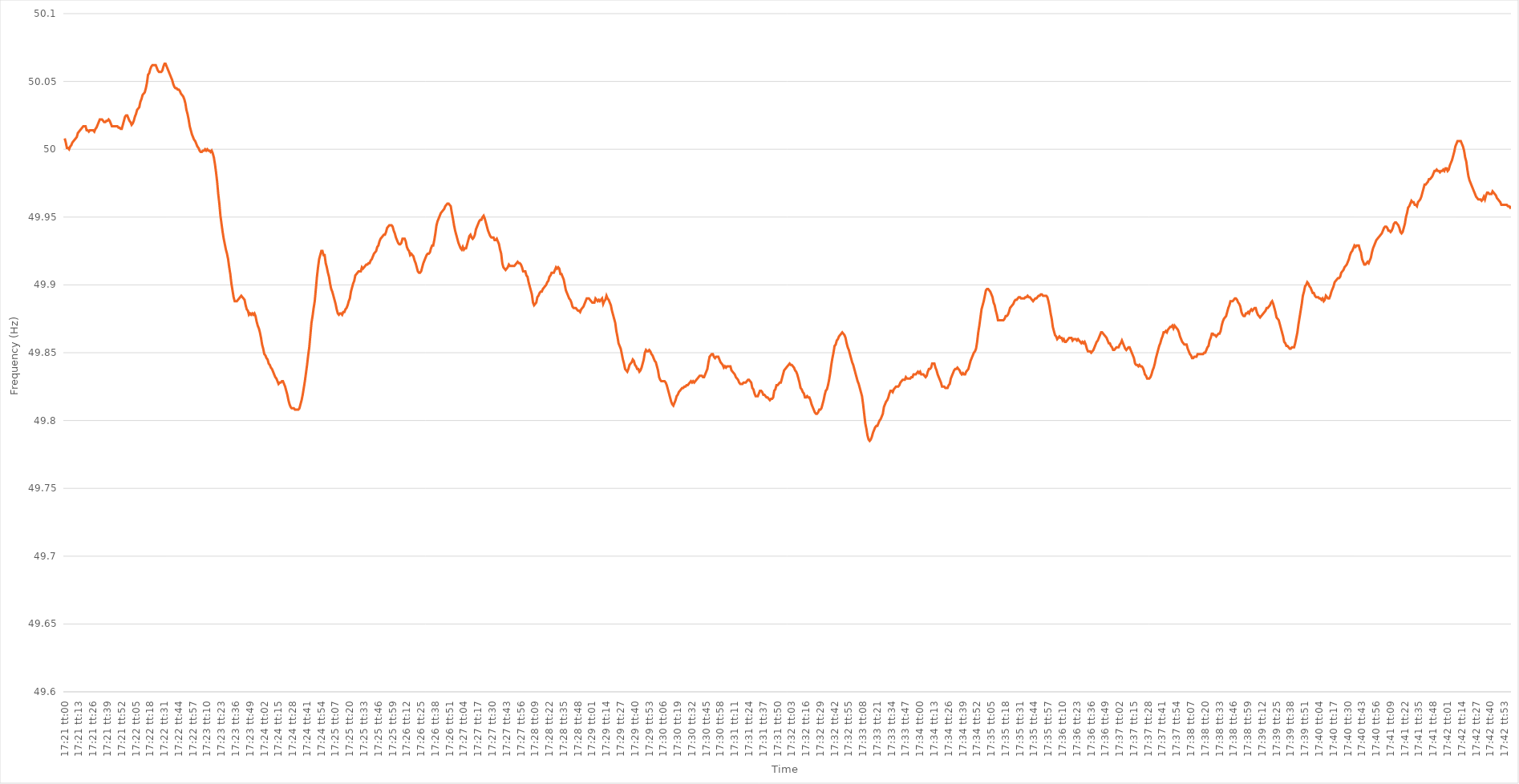
| Category | Series 0 |
|---|---|
| 0.7229166666666668 | 50.008 |
| 0.7229282407407407 | 50.005 |
| 0.7229398148148148 | 50.001 |
| 0.7229513888888889 | 50.001 |
| 0.722962962962963 | 50 |
| 0.722974537037037 | 50.002 |
| 0.7229861111111111 | 50.003 |
| 0.7229976851851853 | 50.005 |
| 0.7230092592592593 | 50.006 |
| 0.7230208333333333 | 50.007 |
| 0.7230324074074074 | 50.008 |
| 0.7230439814814815 | 50.009 |
| 0.7230555555555555 | 50.012 |
| 0.7230671296296296 | 50.013 |
| 0.7230787037037038 | 50.014 |
| 0.7230902777777778 | 50.015 |
| 0.7231018518518518 | 50.016 |
| 0.7231134259259259 | 50.017 |
| 0.723125 | 50.017 |
| 0.7231365740740742 | 50.017 |
| 0.7231481481481481 | 50.014 |
| 0.7231597222222222 | 50.014 |
| 0.7231712962962963 | 50.013 |
| 0.7231828703703704 | 50.014 |
| 0.7231944444444444 | 50.014 |
| 0.7232060185185185 | 50.014 |
| 0.7232175925925927 | 50.014 |
| 0.7232291666666667 | 50.013 |
| 0.7232407407407407 | 50.015 |
| 0.7232523148148148 | 50.016 |
| 0.7232638888888889 | 50.018 |
| 0.7232754629629629 | 50.02 |
| 0.723287037037037 | 50.022 |
| 0.7232986111111112 | 50.022 |
| 0.7233101851851852 | 50.022 |
| 0.7233217592592592 | 50.021 |
| 0.7233333333333333 | 50.02 |
| 0.7233449074074074 | 50.02 |
| 0.7233564814814816 | 50.021 |
| 0.7233680555555555 | 50.021 |
| 0.7233796296296297 | 50.022 |
| 0.7233912037037037 | 50.021 |
| 0.7234027777777778 | 50.019 |
| 0.7234143518518518 | 50.017 |
| 0.7234259259259259 | 50.017 |
| 0.7234375000000001 | 50.017 |
| 0.7234490740740741 | 50.017 |
| 0.7234606481481481 | 50.017 |
| 0.7234722222222222 | 50.017 |
| 0.7234837962962963 | 50.016 |
| 0.7234953703703703 | 50.016 |
| 0.7235069444444444 | 50.015 |
| 0.7235185185185186 | 50.015 |
| 0.7235300925925926 | 50.018 |
| 0.7235416666666666 | 50.021 |
| 0.7235532407407407 | 50.024 |
| 0.7235648148148148 | 50.025 |
| 0.723576388888889 | 50.025 |
| 0.7235879629629629 | 50.023 |
| 0.723599537037037 | 50.021 |
| 0.7236111111111111 | 50.02 |
| 0.7236226851851852 | 50.018 |
| 0.7236342592592592 | 50.019 |
| 0.7236458333333333 | 50.021 |
| 0.7236574074074075 | 50.024 |
| 0.7236689814814815 | 50.026 |
| 0.7236805555555555 | 50.029 |
| 0.7236921296296296 | 50.03 |
| 0.7237037037037037 | 50.031 |
| 0.7237152777777777 | 50.035 |
| 0.7237268518518518 | 50.037 |
| 0.723738425925926 | 50.04 |
| 0.72375 | 50.041 |
| 0.723761574074074 | 50.042 |
| 0.7237731481481481 | 50.045 |
| 0.7237847222222222 | 50.049 |
| 0.7237962962962964 | 50.055 |
| 0.7238078703703703 | 50.056 |
| 0.7238194444444445 | 50.059 |
| 0.7238310185185185 | 50.061 |
| 0.7238425925925926 | 50.062 |
| 0.7238541666666666 | 50.062 |
| 0.7238657407407407 | 50.062 |
| 0.7238773148148149 | 50.062 |
| 0.7238888888888889 | 50.06 |
| 0.723900462962963 | 50.058 |
| 0.723912037037037 | 50.057 |
| 0.7239236111111111 | 50.057 |
| 0.7239351851851853 | 50.057 |
| 0.7239467592592592 | 50.058 |
| 0.7239583333333334 | 50.061 |
| 0.7239699074074074 | 50.063 |
| 0.7239814814814814 | 50.063 |
| 0.7239930555555555 | 50.061 |
| 0.7240046296296296 | 50.059 |
| 0.7240162037037038 | 50.057 |
| 0.7240277777777777 | 50.055 |
| 0.7240393518518519 | 50.053 |
| 0.7240509259259259 | 50.051 |
| 0.7240625 | 50.048 |
| 0.724074074074074 | 50.046 |
| 0.7240856481481481 | 50.045 |
| 0.7240972222222223 | 50.045 |
| 0.7241087962962963 | 50.044 |
| 0.7241203703703704 | 50.044 |
| 0.7241319444444444 | 50.043 |
| 0.7241435185185185 | 50.041 |
| 0.7241550925925927 | 50.04 |
| 0.7241666666666666 | 50.039 |
| 0.7241782407407408 | 50.037 |
| 0.7241898148148148 | 50.034 |
| 0.724201388888889 | 50.029 |
| 0.7242129629629629 | 50.026 |
| 0.724224537037037 | 50.022 |
| 0.7242361111111112 | 50.017 |
| 0.7242476851851851 | 50.014 |
| 0.7242592592592593 | 50.011 |
| 0.7242708333333333 | 50.009 |
| 0.7242824074074075 | 50.007 |
| 0.7242939814814814 | 50.006 |
| 0.7243055555555555 | 50.004 |
| 0.7243171296296297 | 50.002 |
| 0.7243287037037037 | 50.001 |
| 0.7243402777777778 | 49.999 |
| 0.7243518518518518 | 49.998 |
| 0.724363425925926 | 49.998 |
| 0.7243750000000001 | 49.999 |
| 0.724386574074074 | 49.999 |
| 0.7243981481481482 | 50 |
| 0.7244097222222222 | 49.999 |
| 0.7244212962962964 | 50 |
| 0.7244328703703703 | 49.999 |
| 0.7244444444444444 | 49.999 |
| 0.7244560185185186 | 49.998 |
| 0.7244675925925925 | 49.999 |
| 0.7244791666666667 | 49.997 |
| 0.7244907407407407 | 49.994 |
| 0.7245023148148149 | 49.989 |
| 0.7245138888888888 | 49.983 |
| 0.7245254629629629 | 49.976 |
| 0.7245370370370371 | 49.967 |
| 0.7245486111111111 | 49.96 |
| 0.7245601851851852 | 49.951 |
| 0.7245717592592592 | 49.945 |
| 0.7245833333333334 | 49.939 |
| 0.7245949074074075 | 49.934 |
| 0.7246064814814814 | 49.93 |
| 0.7246180555555556 | 49.926 |
| 0.7246296296296296 | 49.923 |
| 0.7246412037037038 | 49.919 |
| 0.7246527777777777 | 49.913 |
| 0.7246643518518519 | 49.908 |
| 0.724675925925926 | 49.901 |
| 0.7246874999999999 | 49.896 |
| 0.7246990740740741 | 49.891 |
| 0.7247106481481481 | 49.888 |
| 0.7247222222222223 | 49.888 |
| 0.7247337962962962 | 49.888 |
| 0.7247453703703703 | 49.889 |
| 0.7247569444444445 | 49.89 |
| 0.7247685185185185 | 49.891 |
| 0.7247800925925926 | 49.892 |
| 0.7247916666666666 | 49.891 |
| 0.7248032407407408 | 49.89 |
| 0.7248148148148149 | 49.889 |
| 0.7248263888888888 | 49.885 |
| 0.724837962962963 | 49.882 |
| 0.724849537037037 | 49.881 |
| 0.7248611111111112 | 49.878 |
| 0.7248726851851851 | 49.879 |
| 0.7248842592592593 | 49.878 |
| 0.7248958333333334 | 49.879 |
| 0.7249074074074073 | 49.878 |
| 0.7249189814814815 | 49.879 |
| 0.7249305555555555 | 49.877 |
| 0.7249421296296297 | 49.873 |
| 0.7249537037037036 | 49.87 |
| 0.7249652777777778 | 49.868 |
| 0.7249768518518519 | 49.865 |
| 0.7249884259259259 | 49.861 |
| 0.725 | 49.856 |
| 0.725011574074074 | 49.853 |
| 0.7250231481481482 | 49.849 |
| 0.7250347222222223 | 49.848 |
| 0.7250462962962962 | 49.846 |
| 0.7250578703703704 | 49.845 |
| 0.7250694444444444 | 49.842 |
| 0.7250810185185186 | 49.841 |
| 0.7250925925925925 | 49.839 |
| 0.7251041666666667 | 49.838 |
| 0.7251157407407408 | 49.836 |
| 0.7251273148148148 | 49.834 |
| 0.7251388888888889 | 49.832 |
| 0.7251504629629629 | 49.831 |
| 0.7251620370370371 | 49.829 |
| 0.725173611111111 | 49.827 |
| 0.7251851851851852 | 49.828 |
| 0.7251967592592593 | 49.828 |
| 0.7252083333333333 | 49.829 |
| 0.7252199074074074 | 49.829 |
| 0.7252314814814814 | 49.827 |
| 0.7252430555555556 | 49.825 |
| 0.7252546296296297 | 49.822 |
| 0.7252662037037036 | 49.819 |
| 0.7252777777777778 | 49.815 |
| 0.7252893518518518 | 49.812 |
| 0.725300925925926 | 49.81 |
| 0.7253124999999999 | 49.809 |
| 0.7253240740740741 | 49.809 |
| 0.7253356481481482 | 49.809 |
| 0.7253472222222223 | 49.808 |
| 0.7253587962962963 | 49.808 |
| 0.7253703703703703 | 49.808 |
| 0.7253819444444445 | 49.808 |
| 0.7253935185185184 | 49.809 |
| 0.7254050925925926 | 49.812 |
| 0.7254166666666667 | 49.815 |
| 0.7254282407407407 | 49.819 |
| 0.7254398148148148 | 49.824 |
| 0.7254513888888888 | 49.829 |
| 0.725462962962963 | 49.835 |
| 0.7254745370370371 | 49.841 |
| 0.725486111111111 | 49.848 |
| 0.7254976851851852 | 49.854 |
| 0.7255092592592592 | 49.863 |
| 0.7255208333333334 | 49.872 |
| 0.7255324074074073 | 49.877 |
| 0.7255439814814815 | 49.883 |
| 0.7255555555555556 | 49.888 |
| 0.7255671296296297 | 49.897 |
| 0.7255787037037037 | 49.906 |
| 0.7255902777777777 | 49.913 |
| 0.7256018518518519 | 49.919 |
| 0.725613425925926 | 49.922 |
| 0.725625 | 49.925 |
| 0.7256365740740741 | 49.925 |
| 0.7256481481481482 | 49.922 |
| 0.7256597222222222 | 49.922 |
| 0.7256712962962962 | 49.916 |
| 0.7256828703703704 | 49.913 |
| 0.7256944444444445 | 49.909 |
| 0.7257060185185185 | 49.906 |
| 0.7257175925925926 | 49.901 |
| 0.7257291666666666 | 49.897 |
| 0.7257407407407408 | 49.895 |
| 0.7257523148148147 | 49.892 |
| 0.7257638888888889 | 49.889 |
| 0.725775462962963 | 49.886 |
| 0.7257870370370371 | 49.882 |
| 0.7257986111111111 | 49.879 |
| 0.7258101851851851 | 49.878 |
| 0.7258217592592593 | 49.879 |
| 0.7258333333333334 | 49.879 |
| 0.7258449074074074 | 49.878 |
| 0.7258564814814815 | 49.88 |
| 0.7258680555555556 | 49.88 |
| 0.7258796296296296 | 49.882 |
| 0.7258912037037036 | 49.883 |
| 0.7259027777777778 | 49.885 |
| 0.7259143518518519 | 49.888 |
| 0.7259259259259259 | 49.89 |
| 0.7259375 | 49.895 |
| 0.725949074074074 | 49.898 |
| 0.7259606481481482 | 49.901 |
| 0.7259722222222221 | 49.903 |
| 0.7259837962962963 | 49.907 |
| 0.7259953703703704 | 49.908 |
| 0.7260069444444445 | 49.909 |
| 0.7260185185185185 | 49.91 |
| 0.7260300925925925 | 49.91 |
| 0.7260416666666667 | 49.91 |
| 0.7260532407407408 | 49.913 |
| 0.7260648148148148 | 49.912 |
| 0.7260763888888889 | 49.913 |
| 0.726087962962963 | 49.914 |
| 0.726099537037037 | 49.915 |
| 0.726111111111111 | 49.915 |
| 0.7261226851851852 | 49.916 |
| 0.7261342592592593 | 49.916 |
| 0.7261458333333333 | 49.918 |
| 0.7261574074074074 | 49.919 |
| 0.7261689814814815 | 49.921 |
| 0.7261805555555556 | 49.923 |
| 0.7261921296296295 | 49.924 |
| 0.7262037037037037 | 49.925 |
| 0.7262152777777778 | 49.928 |
| 0.7262268518518519 | 49.929 |
| 0.7262384259259259 | 49.932 |
| 0.72625 | 49.934 |
| 0.7262615740740741 | 49.935 |
| 0.7262731481481483 | 49.936 |
| 0.7262847222222222 | 49.937 |
| 0.7262962962962963 | 49.937 |
| 0.7263078703703704 | 49.939 |
| 0.7263194444444444 | 49.942 |
| 0.7263310185185184 | 49.943 |
| 0.7263425925925926 | 49.944 |
| 0.7263541666666667 | 49.944 |
| 0.7263657407407407 | 49.944 |
| 0.7263773148148148 | 49.943 |
| 0.7263888888888889 | 49.94 |
| 0.726400462962963 | 49.938 |
| 0.7264120370370369 | 49.935 |
| 0.7264236111111111 | 49.933 |
| 0.7264351851851852 | 49.931 |
| 0.7264467592592593 | 49.93 |
| 0.7264583333333333 | 49.93 |
| 0.7264699074074074 | 49.931 |
| 0.7264814814814815 | 49.934 |
| 0.7264930555555557 | 49.934 |
| 0.7265046296296296 | 49.934 |
| 0.7265162037037037 | 49.932 |
| 0.7265277777777778 | 49.928 |
| 0.7265393518518519 | 49.926 |
| 0.7265509259259259 | 49.925 |
| 0.7265625 | 49.922 |
| 0.7265740740740741 | 49.923 |
| 0.7265856481481481 | 49.922 |
| 0.7265972222222222 | 49.921 |
| 0.7266087962962963 | 49.918 |
| 0.7266203703703704 | 49.916 |
| 0.7266319444444443 | 49.913 |
| 0.7266435185185185 | 49.91 |
| 0.7266550925925926 | 49.909 |
| 0.7266666666666667 | 49.909 |
| 0.7266782407407407 | 49.91 |
| 0.7266898148148148 | 49.913 |
| 0.7267013888888889 | 49.916 |
| 0.7267129629629631 | 49.918 |
| 0.726724537037037 | 49.92 |
| 0.7267361111111111 | 49.922 |
| 0.7267476851851852 | 49.923 |
| 0.7267592592592593 | 49.923 |
| 0.7267708333333333 | 49.924 |
| 0.7267824074074074 | 49.927 |
| 0.7267939814814816 | 49.929 |
| 0.7268055555555556 | 49.929 |
| 0.7268171296296296 | 49.933 |
| 0.7268287037037037 | 49.938 |
| 0.7268402777777778 | 49.944 |
| 0.7268518518518517 | 49.947 |
| 0.7268634259259259 | 49.949 |
| 0.726875 | 49.951 |
| 0.7268865740740741 | 49.953 |
| 0.7268981481481481 | 49.954 |
| 0.7269097222222222 | 49.955 |
| 0.7269212962962963 | 49.956 |
| 0.7269328703703705 | 49.958 |
| 0.7269444444444444 | 49.959 |
| 0.7269560185185185 | 49.96 |
| 0.7269675925925926 | 49.96 |
| 0.7269791666666667 | 49.959 |
| 0.7269907407407407 | 49.958 |
| 0.7270023148148148 | 49.953 |
| 0.727013888888889 | 49.949 |
| 0.727025462962963 | 49.944 |
| 0.727037037037037 | 49.94 |
| 0.7270486111111111 | 49.937 |
| 0.7270601851851852 | 49.934 |
| 0.7270717592592592 | 49.931 |
| 0.7270833333333333 | 49.929 |
| 0.7270949074074075 | 49.927 |
| 0.7271064814814815 | 49.926 |
| 0.7271180555555555 | 49.928 |
| 0.7271296296296296 | 49.926 |
| 0.7271412037037037 | 49.927 |
| 0.7271527777777779 | 49.927 |
| 0.7271643518518518 | 49.93 |
| 0.727175925925926 | 49.933 |
| 0.7271875 | 49.936 |
| 0.7271990740740741 | 49.937 |
| 0.7272106481481481 | 49.935 |
| 0.7272222222222222 | 49.934 |
| 0.7272337962962964 | 49.935 |
| 0.7272453703703704 | 49.937 |
| 0.7272569444444444 | 49.941 |
| 0.7272685185185185 | 49.943 |
| 0.7272800925925926 | 49.945 |
| 0.7272916666666666 | 49.947 |
| 0.7273032407407407 | 49.948 |
| 0.7273148148148149 | 49.948 |
| 0.7273263888888889 | 49.95 |
| 0.7273379629629629 | 49.951 |
| 0.727349537037037 | 49.949 |
| 0.7273611111111111 | 49.946 |
| 0.7273726851851853 | 49.943 |
| 0.7273842592592592 | 49.94 |
| 0.7273958333333334 | 49.938 |
| 0.7274074074074074 | 49.936 |
| 0.7274189814814815 | 49.935 |
| 0.7274305555555555 | 49.935 |
| 0.7274421296296296 | 49.935 |
| 0.7274537037037038 | 49.933 |
| 0.7274652777777778 | 49.933 |
| 0.7274768518518518 | 49.934 |
| 0.7274884259259259 | 49.932 |
| 0.7275 | 49.93 |
| 0.727511574074074 | 49.926 |
| 0.7275231481481481 | 49.923 |
| 0.7275347222222223 | 49.916 |
| 0.7275462962962963 | 49.913 |
| 0.7275578703703703 | 49.912 |
| 0.7275694444444444 | 49.911 |
| 0.7275810185185185 | 49.912 |
| 0.7275925925925927 | 49.913 |
| 0.7276041666666666 | 49.915 |
| 0.7276157407407408 | 49.914 |
| 0.7276273148148148 | 49.914 |
| 0.727638888888889 | 49.914 |
| 0.7276504629629629 | 49.914 |
| 0.727662037037037 | 49.914 |
| 0.7276736111111112 | 49.915 |
| 0.7276851851851852 | 49.916 |
| 0.7276967592592593 | 49.917 |
| 0.7277083333333333 | 49.916 |
| 0.7277199074074074 | 49.916 |
| 0.7277314814814816 | 49.915 |
| 0.7277430555555555 | 49.913 |
| 0.7277546296296297 | 49.91 |
| 0.7277662037037037 | 49.91 |
| 0.7277777777777777 | 49.91 |
| 0.7277893518518518 | 49.907 |
| 0.7278009259259259 | 49.906 |
| 0.7278125000000001 | 49.902 |
| 0.727824074074074 | 49.899 |
| 0.7278356481481482 | 49.896 |
| 0.7278472222222222 | 49.893 |
| 0.7278587962962964 | 49.887 |
| 0.7278703703703703 | 49.885 |
| 0.7278819444444444 | 49.886 |
| 0.7278935185185186 | 49.887 |
| 0.7279050925925926 | 49.891 |
| 0.7279166666666667 | 49.892 |
| 0.7279282407407407 | 49.894 |
| 0.7279398148148148 | 49.895 |
| 0.727951388888889 | 49.895 |
| 0.7279629629629629 | 49.897 |
| 0.7279745370370371 | 49.898 |
| 0.7279861111111111 | 49.899 |
| 0.7279976851851852 | 49.9 |
| 0.7280092592592592 | 49.902 |
| 0.7280208333333333 | 49.903 |
| 0.7280324074074075 | 49.906 |
| 0.7280439814814814 | 49.907 |
| 0.7280555555555556 | 49.909 |
| 0.7280671296296296 | 49.909 |
| 0.7280787037037038 | 49.909 |
| 0.7280902777777777 | 49.911 |
| 0.7281018518518518 | 49.913 |
| 0.728113425925926 | 49.912 |
| 0.728125 | 49.913 |
| 0.7281365740740741 | 49.912 |
| 0.7281481481481481 | 49.908 |
| 0.7281597222222222 | 49.908 |
| 0.7281712962962964 | 49.906 |
| 0.7281828703703703 | 49.904 |
| 0.7281944444444445 | 49.9 |
| 0.7282060185185185 | 49.896 |
| 0.7282175925925927 | 49.894 |
| 0.7282291666666666 | 49.892 |
| 0.7282407407407407 | 49.89 |
| 0.7282523148148149 | 49.889 |
| 0.7282638888888888 | 49.887 |
| 0.728275462962963 | 49.884 |
| 0.728287037037037 | 49.883 |
| 0.7282986111111112 | 49.883 |
| 0.7283101851851851 | 49.883 |
| 0.7283217592592592 | 49.882 |
| 0.7283333333333334 | 49.881 |
| 0.7283449074074074 | 49.881 |
| 0.7283564814814815 | 49.88 |
| 0.7283680555555555 | 49.882 |
| 0.7283796296296297 | 49.883 |
| 0.7283912037037038 | 49.884 |
| 0.7284027777777777 | 49.886 |
| 0.7284143518518519 | 49.888 |
| 0.7284259259259259 | 49.89 |
| 0.7284375000000001 | 49.89 |
| 0.728449074074074 | 49.89 |
| 0.7284606481481481 | 49.889 |
| 0.7284722222222223 | 49.888 |
| 0.7284837962962962 | 49.887 |
| 0.7284953703703704 | 49.887 |
| 0.7285069444444444 | 49.887 |
| 0.7285185185185186 | 49.89 |
| 0.7285300925925925 | 49.889 |
| 0.7285416666666666 | 49.888 |
| 0.7285532407407408 | 49.889 |
| 0.7285648148148148 | 49.888 |
| 0.7285763888888889 | 49.889 |
| 0.7285879629629629 | 49.89 |
| 0.7285995370370371 | 49.886 |
| 0.7286111111111112 | 49.888 |
| 0.7286226851851851 | 49.889 |
| 0.7286342592592593 | 49.892 |
| 0.7286458333333333 | 49.89 |
| 0.7286574074074075 | 49.889 |
| 0.7286689814814814 | 49.887 |
| 0.7286805555555556 | 49.885 |
| 0.7286921296296297 | 49.881 |
| 0.7287037037037036 | 49.878 |
| 0.7287152777777778 | 49.875 |
| 0.7287268518518518 | 49.872 |
| 0.728738425925926 | 49.866 |
| 0.7287499999999999 | 49.862 |
| 0.728761574074074 | 49.857 |
| 0.7287731481481482 | 49.855 |
| 0.7287847222222222 | 49.853 |
| 0.7287962962962963 | 49.849 |
| 0.7288078703703703 | 49.845 |
| 0.7288194444444445 | 49.842 |
| 0.7288310185185186 | 49.838 |
| 0.7288425925925925 | 49.837 |
| 0.7288541666666667 | 49.836 |
| 0.7288657407407407 | 49.838 |
| 0.7288773148148149 | 49.841 |
| 0.7288888888888888 | 49.842 |
| 0.728900462962963 | 49.843 |
| 0.7289120370370371 | 49.845 |
| 0.728923611111111 | 49.844 |
| 0.7289351851851852 | 49.841 |
| 0.7289467592592592 | 49.84 |
| 0.7289583333333334 | 49.838 |
| 0.7289699074074073 | 49.838 |
| 0.7289814814814815 | 49.836 |
| 0.7289930555555556 | 49.837 |
| 0.7290046296296296 | 49.839 |
| 0.7290162037037037 | 49.842 |
| 0.7290277777777777 | 49.845 |
| 0.7290393518518519 | 49.85 |
| 0.729050925925926 | 49.852 |
| 0.7290625 | 49.851 |
| 0.7290740740740741 | 49.851 |
| 0.7290856481481481 | 49.852 |
| 0.7290972222222223 | 49.851 |
| 0.7291087962962962 | 49.849 |
| 0.7291203703703704 | 49.848 |
| 0.7291319444444445 | 49.846 |
| 0.7291435185185186 | 49.844 |
| 0.7291550925925926 | 49.843 |
| 0.7291666666666666 | 49.84 |
| 0.7291782407407408 | 49.837 |
| 0.7291898148148147 | 49.832 |
| 0.7292013888888889 | 49.83 |
| 0.729212962962963 | 49.829 |
| 0.729224537037037 | 49.829 |
| 0.7292361111111111 | 49.829 |
| 0.7292476851851851 | 49.829 |
| 0.7292592592592593 | 49.828 |
| 0.7292708333333334 | 49.826 |
| 0.7292824074074074 | 49.823 |
| 0.7292939814814815 | 49.82 |
| 0.7293055555555555 | 49.817 |
| 0.7293171296296297 | 49.814 |
| 0.7293287037037036 | 49.812 |
| 0.7293402777777778 | 49.811 |
| 0.7293518518518519 | 49.813 |
| 0.729363425925926 | 49.815 |
| 0.729375 | 49.818 |
| 0.729386574074074 | 49.819 |
| 0.7293981481481482 | 49.821 |
| 0.7294097222222223 | 49.822 |
| 0.7294212962962963 | 49.823 |
| 0.7294328703703704 | 49.824 |
| 0.7294444444444445 | 49.824 |
| 0.7294560185185185 | 49.825 |
| 0.7294675925925925 | 49.825 |
| 0.7294791666666667 | 49.826 |
| 0.7294907407407408 | 49.826 |
| 0.7295023148148148 | 49.827 |
| 0.7295138888888889 | 49.828 |
| 0.729525462962963 | 49.829 |
| 0.7295370370370371 | 49.828 |
| 0.729548611111111 | 49.829 |
| 0.7295601851851852 | 49.828 |
| 0.7295717592592593 | 49.829 |
| 0.7295833333333334 | 49.83 |
| 0.7295949074074074 | 49.831 |
| 0.7296064814814814 | 49.832 |
| 0.7296180555555556 | 49.833 |
| 0.7296296296296297 | 49.833 |
| 0.7296412037037037 | 49.833 |
| 0.7296527777777778 | 49.832 |
| 0.7296643518518519 | 49.832 |
| 0.7296759259259259 | 49.834 |
| 0.7296874999999999 | 49.836 |
| 0.7296990740740741 | 49.838 |
| 0.7297106481481482 | 49.843 |
| 0.7297222222222222 | 49.847 |
| 0.7297337962962963 | 49.848 |
| 0.7297453703703703 | 49.849 |
| 0.7297569444444445 | 49.849 |
| 0.7297685185185184 | 49.847 |
| 0.7297800925925926 | 49.846 |
| 0.7297916666666667 | 49.847 |
| 0.7298032407407408 | 49.847 |
| 0.7298148148148148 | 49.847 |
| 0.7298263888888888 | 49.845 |
| 0.729837962962963 | 49.843 |
| 0.7298495370370371 | 49.842 |
| 0.7298611111111111 | 49.841 |
| 0.7298726851851852 | 49.839 |
| 0.7298842592592593 | 49.84 |
| 0.7298958333333333 | 49.839 |
| 0.7299074074074073 | 49.84 |
| 0.7299189814814815 | 49.84 |
| 0.7299305555555556 | 49.84 |
| 0.7299421296296296 | 49.84 |
| 0.7299537037037037 | 49.837 |
| 0.7299652777777778 | 49.836 |
| 0.7299768518518519 | 49.835 |
| 0.7299884259259258 | 49.834 |
| 0.73 | 49.832 |
| 0.7300115740740741 | 49.831 |
| 0.7300231481481482 | 49.83 |
| 0.7300347222222222 | 49.828 |
| 0.7300462962962962 | 49.827 |
| 0.7300578703703704 | 49.827 |
| 0.7300694444444445 | 49.827 |
| 0.7300810185185185 | 49.828 |
| 0.7300925925925926 | 49.828 |
| 0.7301041666666667 | 49.828 |
| 0.7301157407407407 | 49.829 |
| 0.7301273148148147 | 49.83 |
| 0.7301388888888889 | 49.83 |
| 0.730150462962963 | 49.829 |
| 0.730162037037037 | 49.828 |
| 0.7301736111111111 | 49.824 |
| 0.7301851851851852 | 49.823 |
| 0.7301967592592593 | 49.82 |
| 0.7302083333333332 | 49.818 |
| 0.7302199074074074 | 49.818 |
| 0.7302314814814815 | 49.818 |
| 0.7302430555555556 | 49.82 |
| 0.7302546296296296 | 49.822 |
| 0.7302662037037037 | 49.822 |
| 0.7302777777777778 | 49.821 |
| 0.730289351851852 | 49.819 |
| 0.7303009259259259 | 49.819 |
| 0.7303125 | 49.818 |
| 0.7303240740740741 | 49.817 |
| 0.7303356481481482 | 49.817 |
| 0.7303472222222221 | 49.816 |
| 0.7303587962962963 | 49.815 |
| 0.7303703703703704 | 49.816 |
| 0.7303819444444444 | 49.816 |
| 0.7303935185185185 | 49.817 |
| 0.7304050925925926 | 49.822 |
| 0.7304166666666667 | 49.823 |
| 0.7304282407407406 | 49.826 |
| 0.7304398148148148 | 49.826 |
| 0.7304513888888889 | 49.827 |
| 0.730462962962963 | 49.828 |
| 0.730474537037037 | 49.828 |
| 0.7304861111111111 | 49.831 |
| 0.7304976851851852 | 49.834 |
| 0.7305092592592594 | 49.837 |
| 0.7305208333333333 | 49.838 |
| 0.7305324074074074 | 49.839 |
| 0.7305439814814815 | 49.84 |
| 0.7305555555555556 | 49.841 |
| 0.7305671296296296 | 49.842 |
| 0.7305787037037037 | 49.841 |
| 0.7305902777777779 | 49.841 |
| 0.7306018518518519 | 49.84 |
| 0.7306134259259259 | 49.839 |
| 0.730625 | 49.837 |
| 0.7306365740740741 | 49.836 |
| 0.730648148148148 | 49.834 |
| 0.7306597222222222 | 49.831 |
| 0.7306712962962963 | 49.828 |
| 0.7306828703703704 | 49.824 |
| 0.7306944444444444 | 49.823 |
| 0.7307060185185185 | 49.821 |
| 0.7307175925925926 | 49.82 |
| 0.7307291666666668 | 49.817 |
| 0.7307407407407407 | 49.817 |
| 0.7307523148148148 | 49.818 |
| 0.7307638888888889 | 49.817 |
| 0.730775462962963 | 49.817 |
| 0.730787037037037 | 49.815 |
| 0.7307986111111111 | 49.812 |
| 0.7308101851851853 | 49.81 |
| 0.7308217592592593 | 49.808 |
| 0.7308333333333333 | 49.806 |
| 0.7308449074074074 | 49.805 |
| 0.7308564814814815 | 49.805 |
| 0.7308680555555555 | 49.806 |
| 0.7308796296296296 | 49.808 |
| 0.7308912037037038 | 49.808 |
| 0.7309027777777778 | 49.809 |
| 0.7309143518518518 | 49.812 |
| 0.7309259259259259 | 49.815 |
| 0.7309375 | 49.819 |
| 0.7309490740740742 | 49.822 |
| 0.7309606481481481 | 49.823 |
| 0.7309722222222222 | 49.826 |
| 0.7309837962962963 | 49.83 |
| 0.7309953703703704 | 49.835 |
| 0.7310069444444444 | 49.841 |
| 0.7310185185185185 | 49.846 |
| 0.7310300925925927 | 49.85 |
| 0.7310416666666667 | 49.855 |
| 0.7310532407407407 | 49.856 |
| 0.7310648148148148 | 49.859 |
| 0.7310763888888889 | 49.86 |
| 0.7310879629629629 | 49.862 |
| 0.731099537037037 | 49.863 |
| 0.7311111111111112 | 49.864 |
| 0.7311226851851852 | 49.865 |
| 0.7311342592592592 | 49.864 |
| 0.7311458333333333 | 49.863 |
| 0.7311574074074074 | 49.861 |
| 0.7311689814814816 | 49.857 |
| 0.7311805555555555 | 49.854 |
| 0.7311921296296297 | 49.852 |
| 0.7312037037037037 | 49.849 |
| 0.7312152777777778 | 49.846 |
| 0.7312268518518518 | 49.843 |
| 0.7312384259259259 | 49.841 |
| 0.7312500000000001 | 49.838 |
| 0.7312615740740741 | 49.835 |
| 0.7312731481481481 | 49.832 |
| 0.7312847222222222 | 49.829 |
| 0.7312962962962963 | 49.827 |
| 0.7313078703703703 | 49.824 |
| 0.7313194444444444 | 49.821 |
| 0.7313310185185186 | 49.818 |
| 0.7313425925925926 | 49.812 |
| 0.7313541666666666 | 49.805 |
| 0.7313657407407407 | 49.798 |
| 0.7313773148148148 | 49.794 |
| 0.731388888888889 | 49.789 |
| 0.7314004629629629 | 49.786 |
| 0.731412037037037 | 49.785 |
| 0.7314236111111111 | 49.786 |
| 0.7314351851851852 | 49.788 |
| 0.7314467592592592 | 49.791 |
| 0.7314583333333333 | 49.793 |
| 0.7314699074074075 | 49.795 |
| 0.7314814814814815 | 49.796 |
| 0.7314930555555555 | 49.796 |
| 0.7315046296296296 | 49.798 |
| 0.7315162037037037 | 49.8 |
| 0.7315277777777777 | 49.801 |
| 0.7315393518518518 | 49.803 |
| 0.731550925925926 | 49.805 |
| 0.7315625 | 49.81 |
| 0.731574074074074 | 49.812 |
| 0.7315856481481481 | 49.814 |
| 0.7315972222222222 | 49.815 |
| 0.7316087962962964 | 49.817 |
| 0.7316203703703703 | 49.82 |
| 0.7316319444444445 | 49.822 |
| 0.7316435185185185 | 49.822 |
| 0.7316550925925926 | 49.821 |
| 0.7316666666666666 | 49.823 |
| 0.7316782407407407 | 49.824 |
| 0.7316898148148149 | 49.825 |
| 0.7317013888888889 | 49.825 |
| 0.731712962962963 | 49.825 |
| 0.731724537037037 | 49.826 |
| 0.7317361111111111 | 49.828 |
| 0.7317476851851853 | 49.829 |
| 0.7317592592592592 | 49.83 |
| 0.7317708333333334 | 49.83 |
| 0.7317824074074074 | 49.83 |
| 0.7317939814814814 | 49.832 |
| 0.7318055555555555 | 49.831 |
| 0.7318171296296296 | 49.831 |
| 0.7318287037037038 | 49.831 |
| 0.7318402777777777 | 49.831 |
| 0.7318518518518519 | 49.832 |
| 0.7318634259259259 | 49.832 |
| 0.731875 | 49.834 |
| 0.731886574074074 | 49.834 |
| 0.7318981481481481 | 49.834 |
| 0.7319097222222223 | 49.835 |
| 0.7319212962962963 | 49.836 |
| 0.7319328703703704 | 49.835 |
| 0.7319444444444444 | 49.836 |
| 0.7319560185185185 | 49.834 |
| 0.7319675925925927 | 49.834 |
| 0.7319791666666666 | 49.834 |
| 0.7319907407407408 | 49.833 |
| 0.7320023148148148 | 49.832 |
| 0.732013888888889 | 49.833 |
| 0.7320254629629629 | 49.836 |
| 0.732037037037037 | 49.838 |
| 0.7320486111111112 | 49.838 |
| 0.7320601851851851 | 49.839 |
| 0.7320717592592593 | 49.842 |
| 0.7320833333333333 | 49.842 |
| 0.7320949074074075 | 49.842 |
| 0.7321064814814814 | 49.839 |
| 0.7321180555555555 | 49.837 |
| 0.7321296296296297 | 49.834 |
| 0.7321412037037037 | 49.832 |
| 0.7321527777777778 | 49.83 |
| 0.7321643518518518 | 49.828 |
| 0.732175925925926 | 49.825 |
| 0.7321875000000001 | 49.825 |
| 0.732199074074074 | 49.825 |
| 0.7322106481481482 | 49.824 |
| 0.7322222222222222 | 49.824 |
| 0.7322337962962964 | 49.824 |
| 0.7322453703703703 | 49.826 |
| 0.7322569444444444 | 49.827 |
| 0.7322685185185186 | 49.831 |
| 0.7322800925925925 | 49.833 |
| 0.7322916666666667 | 49.835 |
| 0.7323032407407407 | 49.837 |
| 0.7323148148148149 | 49.838 |
| 0.7323263888888888 | 49.838 |
| 0.7323379629629629 | 49.839 |
| 0.7323495370370371 | 49.838 |
| 0.7323611111111111 | 49.837 |
| 0.7323726851851852 | 49.835 |
| 0.7323842592592592 | 49.834 |
| 0.7323958333333334 | 49.835 |
| 0.7324074074074075 | 49.834 |
| 0.7324189814814814 | 49.834 |
| 0.7324305555555556 | 49.836 |
| 0.7324421296296296 | 49.837 |
| 0.7324537037037038 | 49.838 |
| 0.7324652777777777 | 49.841 |
| 0.7324768518518519 | 49.844 |
| 0.732488425925926 | 49.846 |
| 0.7324999999999999 | 49.848 |
| 0.7325115740740741 | 49.85 |
| 0.7325231481481481 | 49.851 |
| 0.7325347222222223 | 49.853 |
| 0.7325462962962962 | 49.858 |
| 0.7325578703703703 | 49.865 |
| 0.7325694444444445 | 49.87 |
| 0.7325810185185185 | 49.876 |
| 0.7325925925925926 | 49.882 |
| 0.7326041666666666 | 49.885 |
| 0.7326157407407408 | 49.888 |
| 0.7326273148148149 | 49.892 |
| 0.7326388888888888 | 49.896 |
| 0.732650462962963 | 49.897 |
| 0.732662037037037 | 49.897 |
| 0.7326736111111112 | 49.896 |
| 0.7326851851851851 | 49.895 |
| 0.7326967592592593 | 49.893 |
| 0.7327083333333334 | 49.891 |
| 0.7327199074074073 | 49.887 |
| 0.7327314814814815 | 49.885 |
| 0.7327430555555555 | 49.881 |
| 0.7327546296296297 | 49.878 |
| 0.7327662037037036 | 49.874 |
| 0.7327777777777778 | 49.874 |
| 0.7327893518518519 | 49.874 |
| 0.7328009259259259 | 49.874 |
| 0.7328125 | 49.874 |
| 0.732824074074074 | 49.874 |
| 0.7328356481481482 | 49.875 |
| 0.7328472222222223 | 49.877 |
| 0.7328587962962962 | 49.877 |
| 0.7328703703703704 | 49.878 |
| 0.7328819444444444 | 49.88 |
| 0.7328935185185186 | 49.883 |
| 0.7329050925925925 | 49.884 |
| 0.7329166666666667 | 49.885 |
| 0.7329282407407408 | 49.886 |
| 0.7329398148148147 | 49.888 |
| 0.7329513888888889 | 49.889 |
| 0.7329629629629629 | 49.889 |
| 0.7329745370370371 | 49.89 |
| 0.732986111111111 | 49.891 |
| 0.7329976851851852 | 49.891 |
| 0.7330092592592593 | 49.89 |
| 0.7330208333333333 | 49.89 |
| 0.7330324074074074 | 49.89 |
| 0.7330439814814814 | 49.89 |
| 0.7330555555555556 | 49.891 |
| 0.7330671296296297 | 49.891 |
| 0.7330787037037036 | 49.892 |
| 0.7330902777777778 | 49.891 |
| 0.7331018518518518 | 49.891 |
| 0.733113425925926 | 49.89 |
| 0.7331249999999999 | 49.889 |
| 0.7331365740740741 | 49.888 |
| 0.7331481481481482 | 49.889 |
| 0.7331597222222223 | 49.89 |
| 0.7331712962962963 | 49.89 |
| 0.7331828703703703 | 49.891 |
| 0.7331944444444445 | 49.892 |
| 0.7332060185185186 | 49.892 |
| 0.7332175925925926 | 49.893 |
| 0.7332291666666667 | 49.893 |
| 0.7332407407407407 | 49.892 |
| 0.7332523148148148 | 49.892 |
| 0.7332638888888888 | 49.892 |
| 0.733275462962963 | 49.892 |
| 0.7332870370370371 | 49.891 |
| 0.733298611111111 | 49.888 |
| 0.7333101851851852 | 49.884 |
| 0.7333217592592592 | 49.879 |
| 0.7333333333333334 | 49.875 |
| 0.7333449074074073 | 49.869 |
| 0.7333564814814815 | 49.866 |
| 0.7333680555555556 | 49.863 |
| 0.7333796296296297 | 49.862 |
| 0.7333912037037037 | 49.86 |
| 0.7334027777777777 | 49.861 |
| 0.7334143518518519 | 49.862 |
| 0.733425925925926 | 49.861 |
| 0.7334375 | 49.861 |
| 0.7334490740740741 | 49.859 |
| 0.7334606481481482 | 49.86 |
| 0.7334722222222222 | 49.858 |
| 0.7334837962962962 | 49.858 |
| 0.7334953703703704 | 49.859 |
| 0.7335069444444445 | 49.86 |
| 0.7335185185185185 | 49.861 |
| 0.7335300925925926 | 49.861 |
| 0.7335416666666666 | 49.861 |
| 0.7335532407407408 | 49.859 |
| 0.7335648148148147 | 49.86 |
| 0.7335763888888889 | 49.86 |
| 0.733587962962963 | 49.86 |
| 0.7335995370370371 | 49.859 |
| 0.7336111111111111 | 49.86 |
| 0.7336226851851851 | 49.859 |
| 0.7336342592592593 | 49.858 |
| 0.7336458333333334 | 49.857 |
| 0.7336574074074074 | 49.858 |
| 0.7336689814814815 | 49.857 |
| 0.7336805555555556 | 49.858 |
| 0.7336921296296296 | 49.856 |
| 0.7337037037037036 | 49.853 |
| 0.7337152777777778 | 49.851 |
| 0.7337268518518519 | 49.851 |
| 0.7337384259259259 | 49.851 |
| 0.73375 | 49.85 |
| 0.733761574074074 | 49.851 |
| 0.7337731481481482 | 49.852 |
| 0.7337847222222221 | 49.854 |
| 0.7337962962962963 | 49.856 |
| 0.7338078703703704 | 49.858 |
| 0.7338194444444445 | 49.859 |
| 0.7338310185185185 | 49.861 |
| 0.7338425925925925 | 49.863 |
| 0.7338541666666667 | 49.865 |
| 0.7338657407407408 | 49.865 |
| 0.7338773148148148 | 49.864 |
| 0.7338888888888889 | 49.863 |
| 0.733900462962963 | 49.862 |
| 0.733912037037037 | 49.861 |
| 0.733923611111111 | 49.859 |
| 0.7339351851851852 | 49.857 |
| 0.7339467592592593 | 49.857 |
| 0.7339583333333333 | 49.855 |
| 0.7339699074074074 | 49.854 |
| 0.7339814814814815 | 49.852 |
| 0.7339930555555556 | 49.852 |
| 0.7340046296296295 | 49.853 |
| 0.7340162037037037 | 49.854 |
| 0.7340277777777778 | 49.854 |
| 0.7340393518518519 | 49.854 |
| 0.7340509259259259 | 49.856 |
| 0.7340625 | 49.857 |
| 0.7340740740740741 | 49.859 |
| 0.7340856481481483 | 49.857 |
| 0.7340972222222222 | 49.855 |
| 0.7341087962962963 | 49.853 |
| 0.7341203703703704 | 49.852 |
| 0.7341319444444444 | 49.853 |
| 0.7341435185185184 | 49.854 |
| 0.7341550925925926 | 49.854 |
| 0.7341666666666667 | 49.852 |
| 0.7341782407407407 | 49.85 |
| 0.7341898148148148 | 49.848 |
| 0.7342013888888889 | 49.846 |
| 0.734212962962963 | 49.842 |
| 0.7342245370370369 | 49.841 |
| 0.7342361111111111 | 49.841 |
| 0.7342476851851852 | 49.84 |
| 0.7342592592592593 | 49.841 |
| 0.7342708333333333 | 49.84 |
| 0.7342824074074074 | 49.84 |
| 0.7342939814814815 | 49.839 |
| 0.7343055555555557 | 49.837 |
| 0.7343171296296296 | 49.834 |
| 0.7343287037037037 | 49.833 |
| 0.7343402777777778 | 49.831 |
| 0.7343518518518519 | 49.831 |
| 0.7343634259259259 | 49.831 |
| 0.734375 | 49.832 |
| 0.7343865740740741 | 49.834 |
| 0.7343981481481481 | 49.837 |
| 0.7344097222222222 | 49.839 |
| 0.7344212962962963 | 49.842 |
| 0.7344328703703704 | 49.846 |
| 0.7344444444444443 | 49.849 |
| 0.7344560185185185 | 49.852 |
| 0.7344675925925926 | 49.855 |
| 0.7344791666666667 | 49.857 |
| 0.7344907407407407 | 49.86 |
| 0.7345023148148148 | 49.862 |
| 0.7345138888888889 | 49.865 |
| 0.7345254629629631 | 49.865 |
| 0.734537037037037 | 49.866 |
| 0.7345486111111111 | 49.865 |
| 0.7345601851851852 | 49.867 |
| 0.7345717592592593 | 49.868 |
| 0.7345833333333333 | 49.869 |
| 0.7345949074074074 | 49.869 |
| 0.7346064814814816 | 49.87 |
| 0.7346180555555556 | 49.868 |
| 0.7346296296296296 | 49.87 |
| 0.7346412037037037 | 49.869 |
| 0.7346527777777778 | 49.868 |
| 0.7346643518518517 | 49.867 |
| 0.7346759259259259 | 49.865 |
| 0.7346875 | 49.862 |
| 0.7346990740740741 | 49.86 |
| 0.7347106481481481 | 49.858 |
| 0.7347222222222222 | 49.857 |
| 0.7347337962962963 | 49.856 |
| 0.7347453703703705 | 49.856 |
| 0.7347569444444444 | 49.856 |
| 0.7347685185185185 | 49.853 |
| 0.7347800925925926 | 49.851 |
| 0.7347916666666667 | 49.849 |
| 0.7348032407407407 | 49.848 |
| 0.7348148148148148 | 49.846 |
| 0.734826388888889 | 49.846 |
| 0.734837962962963 | 49.847 |
| 0.734849537037037 | 49.847 |
| 0.7348611111111111 | 49.847 |
| 0.7348726851851852 | 49.849 |
| 0.7348842592592592 | 49.849 |
| 0.7348958333333333 | 49.849 |
| 0.7349074074074075 | 49.849 |
| 0.7349189814814815 | 49.849 |
| 0.7349305555555555 | 49.849 |
| 0.7349421296296296 | 49.85 |
| 0.7349537037037037 | 49.85 |
| 0.7349652777777779 | 49.852 |
| 0.7349768518518518 | 49.854 |
| 0.734988425925926 | 49.855 |
| 0.735 | 49.859 |
| 0.7350115740740741 | 49.861 |
| 0.7350231481481481 | 49.864 |
| 0.7350347222222222 | 49.864 |
| 0.7350462962962964 | 49.863 |
| 0.7350578703703704 | 49.863 |
| 0.7350694444444444 | 49.862 |
| 0.7350810185185185 | 49.863 |
| 0.7350925925925926 | 49.864 |
| 0.7351041666666666 | 49.864 |
| 0.7351157407407407 | 49.866 |
| 0.7351273148148149 | 49.87 |
| 0.7351388888888889 | 49.873 |
| 0.7351504629629629 | 49.875 |
| 0.735162037037037 | 49.876 |
| 0.7351736111111111 | 49.877 |
| 0.7351851851851853 | 49.88 |
| 0.7351967592592592 | 49.883 |
| 0.7352083333333334 | 49.885 |
| 0.7352199074074074 | 49.888 |
| 0.7352314814814815 | 49.888 |
| 0.7352430555555555 | 49.888 |
| 0.7352546296296296 | 49.889 |
| 0.7352662037037038 | 49.89 |
| 0.7352777777777778 | 49.89 |
| 0.7352893518518518 | 49.889 |
| 0.7353009259259259 | 49.887 |
| 0.7353125 | 49.886 |
| 0.735324074074074 | 49.884 |
| 0.7353356481481481 | 49.88 |
| 0.7353472222222223 | 49.878 |
| 0.7353587962962963 | 49.877 |
| 0.7353703703703703 | 49.877 |
| 0.7353819444444444 | 49.879 |
| 0.7353935185185185 | 49.879 |
| 0.7354050925925927 | 49.88 |
| 0.7354166666666666 | 49.879 |
| 0.7354282407407408 | 49.881 |
| 0.7354398148148148 | 49.882 |
| 0.735451388888889 | 49.881 |
| 0.7354629629629629 | 49.882 |
| 0.735474537037037 | 49.883 |
| 0.7354861111111112 | 49.883 |
| 0.7354976851851852 | 49.88 |
| 0.7355092592592593 | 49.878 |
| 0.7355208333333333 | 49.877 |
| 0.7355324074074074 | 49.876 |
| 0.7355439814814814 | 49.877 |
| 0.7355555555555555 | 49.878 |
| 0.7355671296296297 | 49.879 |
| 0.7355787037037037 | 49.88 |
| 0.7355902777777777 | 49.881 |
| 0.7356018518518518 | 49.883 |
| 0.7356134259259259 | 49.883 |
| 0.7356250000000001 | 49.884 |
| 0.735636574074074 | 49.885 |
| 0.7356481481481482 | 49.887 |
| 0.7356597222222222 | 49.888 |
| 0.7356712962962964 | 49.886 |
| 0.7356828703703703 | 49.883 |
| 0.7356944444444444 | 49.88 |
| 0.7357060185185186 | 49.876 |
| 0.7357175925925926 | 49.875 |
| 0.7357291666666667 | 49.874 |
| 0.7357407407407407 | 49.871 |
| 0.7357523148148148 | 49.868 |
| 0.735763888888889 | 49.865 |
| 0.7357754629629629 | 49.862 |
| 0.7357870370370371 | 49.858 |
| 0.7357986111111111 | 49.857 |
| 0.7358101851851853 | 49.855 |
| 0.7358217592592592 | 49.855 |
| 0.7358333333333333 | 49.854 |
| 0.7358449074074075 | 49.853 |
| 0.7358564814814814 | 49.853 |
| 0.7358680555555556 | 49.854 |
| 0.7358796296296296 | 49.854 |
| 0.7358912037037038 | 49.854 |
| 0.7359027777777777 | 49.857 |
| 0.7359143518518518 | 49.861 |
| 0.735925925925926 | 49.865 |
| 0.7359375 | 49.871 |
| 0.7359490740740741 | 49.876 |
| 0.7359606481481481 | 49.881 |
| 0.7359722222222222 | 49.886 |
| 0.7359837962962964 | 49.892 |
| 0.7359953703703703 | 49.895 |
| 0.7360069444444445 | 49.899 |
| 0.7360185185185185 | 49.9 |
| 0.7360300925925927 | 49.902 |
| 0.7360416666666666 | 49.901 |
| 0.7360532407407407 | 49.899 |
| 0.7360648148148149 | 49.898 |
| 0.7360763888888888 | 49.896 |
| 0.736087962962963 | 49.894 |
| 0.736099537037037 | 49.894 |
| 0.7361111111111112 | 49.892 |
| 0.7361226851851851 | 49.891 |
| 0.7361342592592592 | 49.891 |
| 0.7361458333333334 | 49.891 |
| 0.7361574074074074 | 49.89 |
| 0.7361689814814815 | 49.89 |
| 0.7361805555555555 | 49.889 |
| 0.7361921296296297 | 49.89 |
| 0.7362037037037038 | 49.888 |
| 0.7362152777777777 | 49.889 |
| 0.7362268518518519 | 49.892 |
| 0.7362384259259259 | 49.891 |
| 0.7362500000000001 | 49.89 |
| 0.736261574074074 | 49.89 |
| 0.7362731481481481 | 49.892 |
| 0.7362847222222223 | 49.895 |
| 0.7362962962962962 | 49.897 |
| 0.7363078703703704 | 49.899 |
| 0.7363194444444444 | 49.902 |
| 0.7363310185185186 | 49.903 |
| 0.7363425925925925 | 49.904 |
| 0.7363541666666666 | 49.905 |
| 0.7363657407407408 | 49.905 |
| 0.7363773148148148 | 49.906 |
| 0.7363888888888889 | 49.909 |
| 0.7364004629629629 | 49.91 |
| 0.7364120370370371 | 49.911 |
| 0.7364236111111112 | 49.913 |
| 0.7364351851851851 | 49.914 |
| 0.7364467592592593 | 49.915 |
| 0.7364583333333333 | 49.917 |
| 0.7364699074074075 | 49.919 |
| 0.7364814814814814 | 49.922 |
| 0.7364930555555556 | 49.924 |
| 0.7365046296296297 | 49.925 |
| 0.7365162037037036 | 49.927 |
| 0.7365277777777778 | 49.929 |
| 0.7365393518518518 | 49.928 |
| 0.736550925925926 | 49.929 |
| 0.7365624999999999 | 49.929 |
| 0.736574074074074 | 49.929 |
| 0.7365856481481482 | 49.926 |
| 0.7365972222222222 | 49.924 |
| 0.7366087962962963 | 49.919 |
| 0.7366203703703703 | 49.917 |
| 0.7366319444444445 | 49.915 |
| 0.7366435185185186 | 49.915 |
| 0.7366550925925925 | 49.916 |
| 0.7366666666666667 | 49.917 |
| 0.7366782407407407 | 49.916 |
| 0.7366898148148149 | 49.918 |
| 0.7367013888888888 | 49.92 |
| 0.736712962962963 | 49.924 |
| 0.7367245370370371 | 49.927 |
| 0.736736111111111 | 49.929 |
| 0.7367476851851852 | 49.931 |
| 0.7367592592592592 | 49.933 |
| 0.7367708333333334 | 49.934 |
| 0.7367824074074073 | 49.935 |
| 0.7367939814814815 | 49.936 |
| 0.7368055555555556 | 49.937 |
| 0.7368171296296296 | 49.938 |
| 0.7368287037037037 | 49.94 |
| 0.7368402777777777 | 49.942 |
| 0.7368518518518519 | 49.943 |
| 0.736863425925926 | 49.943 |
| 0.736875 | 49.942 |
| 0.7368865740740741 | 49.94 |
| 0.7368981481481481 | 49.94 |
| 0.7369097222222223 | 49.939 |
| 0.7369212962962962 | 49.94 |
| 0.7369328703703704 | 49.942 |
| 0.7369444444444445 | 49.945 |
| 0.7369560185185186 | 49.946 |
| 0.7369675925925926 | 49.946 |
| 0.7369791666666666 | 49.945 |
| 0.7369907407407408 | 49.944 |
| 0.7370023148148147 | 49.942 |
| 0.7370138888888889 | 49.939 |
| 0.737025462962963 | 49.938 |
| 0.737037037037037 | 49.939 |
| 0.7370486111111111 | 49.942 |
| 0.7370601851851851 | 49.945 |
| 0.7370717592592593 | 49.95 |
| 0.7370833333333334 | 49.953 |
| 0.7370949074074074 | 49.957 |
| 0.7371064814814815 | 49.958 |
| 0.7371180555555555 | 49.96 |
| 0.7371296296296297 | 49.962 |
| 0.7371412037037036 | 49.961 |
| 0.7371527777777778 | 49.961 |
| 0.7371643518518519 | 49.959 |
| 0.737175925925926 | 49.959 |
| 0.7371875 | 49.958 |
| 0.737199074074074 | 49.961 |
| 0.7372106481481482 | 49.962 |
| 0.7372222222222223 | 49.963 |
| 0.7372337962962963 | 49.965 |
| 0.7372453703703704 | 49.968 |
| 0.7372569444444445 | 49.971 |
| 0.7372685185185185 | 49.974 |
| 0.7372800925925925 | 49.974 |
| 0.7372916666666667 | 49.975 |
| 0.7373032407407408 | 49.976 |
| 0.7373148148148148 | 49.978 |
| 0.7373263888888889 | 49.978 |
| 0.737337962962963 | 49.979 |
| 0.7373495370370371 | 49.98 |
| 0.737361111111111 | 49.982 |
| 0.7373726851851852 | 49.984 |
| 0.7373842592592593 | 49.984 |
| 0.7373958333333334 | 49.985 |
| 0.7374074074074074 | 49.984 |
| 0.7374189814814814 | 49.984 |
| 0.7374305555555556 | 49.983 |
| 0.7374421296296297 | 49.984 |
| 0.7374537037037037 | 49.984 |
| 0.7374652777777778 | 49.985 |
| 0.7374768518518519 | 49.984 |
| 0.7374884259259259 | 49.986 |
| 0.7374999999999999 | 49.986 |
| 0.7375115740740741 | 49.984 |
| 0.7375231481481482 | 49.985 |
| 0.7375347222222222 | 49.988 |
| 0.7375462962962963 | 49.99 |
| 0.7375578703703703 | 49.992 |
| 0.7375694444444445 | 49.995 |
| 0.7375810185185184 | 49.998 |
| 0.7375925925925926 | 50.002 |
| 0.7376041666666667 | 50.004 |
| 0.7376157407407408 | 50.006 |
| 0.7376273148148148 | 50.006 |
| 0.7376388888888888 | 50.006 |
| 0.737650462962963 | 50.006 |
| 0.7376620370370371 | 50.004 |
| 0.7376736111111111 | 50.002 |
| 0.7376851851851852 | 49.999 |
| 0.7376967592592593 | 49.994 |
| 0.7377083333333333 | 49.991 |
| 0.7377199074074073 | 49.985 |
| 0.7377314814814815 | 49.98 |
| 0.7377430555555556 | 49.977 |
| 0.7377546296296296 | 49.975 |
| 0.7377662037037037 | 49.973 |
| 0.7377777777777778 | 49.971 |
| 0.7377893518518519 | 49.969 |
| 0.7378009259259258 | 49.967 |
| 0.7378125 | 49.965 |
| 0.7378240740740741 | 49.964 |
| 0.7378356481481482 | 49.963 |
| 0.7378472222222222 | 49.963 |
| 0.7378587962962962 | 49.963 |
| 0.7378703703703704 | 49.962 |
| 0.7378819444444445 | 49.963 |
| 0.7378935185185185 | 49.965 |
| 0.7379050925925926 | 49.963 |
| 0.7379166666666667 | 49.966 |
| 0.7379282407407407 | 49.968 |
| 0.7379398148148147 | 49.968 |
| 0.7379513888888889 | 49.967 |
| 0.737962962962963 | 49.967 |
| 0.737974537037037 | 49.967 |
| 0.7379861111111111 | 49.969 |
| 0.7379976851851852 | 49.968 |
| 0.7380092592592593 | 49.967 |
| 0.7380208333333332 | 49.966 |
| 0.7380324074074074 | 49.964 |
| 0.7380439814814815 | 49.963 |
| 0.7380555555555556 | 49.962 |
| 0.7380671296296296 | 49.961 |
| 0.7380787037037037 | 49.959 |
| 0.7380902777777778 | 49.959 |
| 0.738101851851852 | 49.959 |
| 0.7381134259259259 | 49.959 |
| 0.738125 | 49.959 |
| 0.7381365740740741 | 49.959 |
| 0.7381481481481481 | 49.958 |
| 0.7381597222222221 | 49.958 |
| 0.7381712962962963 | 49.957 |
| 0.7381828703703704 | 49.958 |